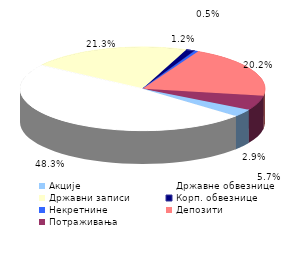
| Category | Series 0 |
|---|---|
| Акције | 0.029 |
| Државне обвезнице | 0.483 |
| Државни записи | 0.213 |
| Корп. обвезнице | 0.012 |
| Некретнине | 0.005 |
| Депозити  | 0.202 |
| Потраживања | 0.057 |